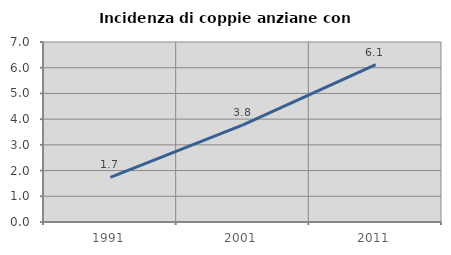
| Category | Incidenza di coppie anziane con figli |
|---|---|
| 1991.0 | 1.739 |
| 2001.0 | 3.774 |
| 2011.0 | 6.122 |